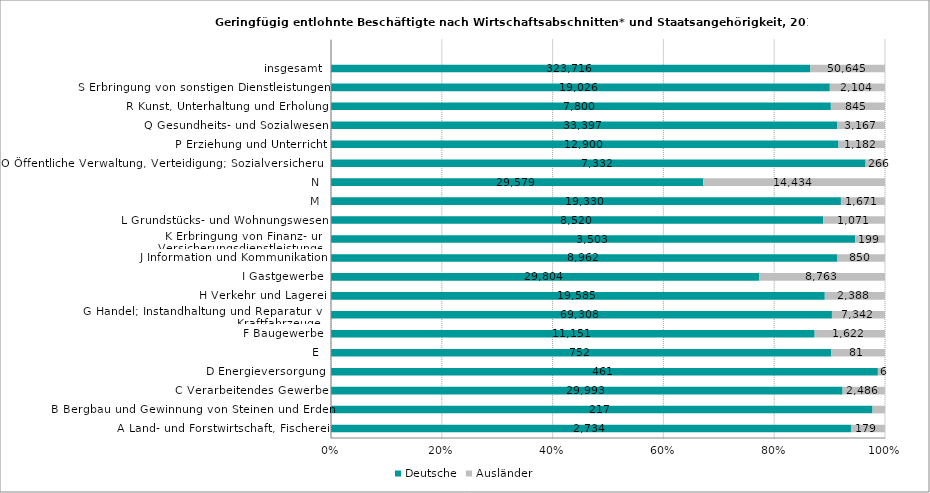
| Category | Deutsche | Ausländer |
|---|---|---|
| A Land- und Forstwirtschaft, Fischerei | 2734 | 179 |
| B Bergbau und Gewinnung von Steinen und Erden | 217 | 5 |
| C Verarbeitendes Gewerbe | 29993 | 2486 |
| D Energieversorgung | 461 | 6 |
| E | 752 | 81 |
| F Baugewerbe | 11151 | 1622 |
| G Handel; Instandhaltung und Reparatur von Kraftfahrzeugen | 69308 | 7342 |
| H Verkehr und Lagerei | 19585 | 2388 |
| I Gastgewerbe | 29804 | 8763 |
| J Information und Kommunikation | 8962 | 850 |
| K Erbringung von Finanz- und Versicherungsdienstleistungen | 3503 | 199 |
| L Grundstücks- und Wohnungswesen | 8520 | 1071 |
| M | 19330 | 1671 |
| N | 29579 | 14434 |
| O Öffentliche Verwaltung, Verteidigung; Sozialversicherung | 7332 | 266 |
| P Erziehung und Unterricht | 12900 | 1182 |
| Q Gesundheits- und Sozialwesen | 33397 | 3167 |
| R Kunst, Unterhaltung und Erholung | 7800 | 845 |
| S Erbringung von sonstigen Dienstleistungen | 19026 | 2104 |
| insgesamt | 323716 | 50645 |